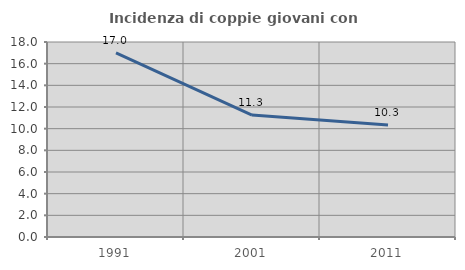
| Category | Incidenza di coppie giovani con figli |
|---|---|
| 1991.0 | 16.995 |
| 2001.0 | 11.256 |
| 2011.0 | 10.349 |